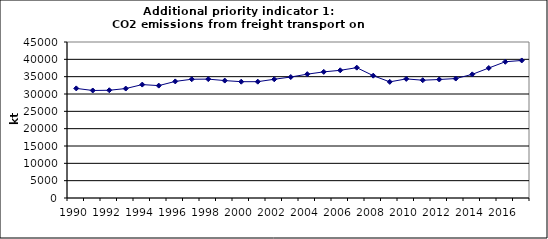
| Category | CO2 emissions from freight transport on road, kt  |
|---|---|
| 1990 | 31613.909 |
| 1991 | 31013.803 |
| 1992 | 31081.447 |
| 1993 | 31569.845 |
| 1994 | 32717.597 |
| 1995 | 32418.208 |
| 1996 | 33629.364 |
| 1997 | 34257.222 |
| 1998 | 34292.116 |
| 1999 | 33868.081 |
| 2000 | 33547.63 |
| 2001 | 33554.722 |
| 2002 | 34250.987 |
| 2003 | 34895.69 |
| 2004 | 35721.267 |
| 2005 | 36384.354 |
| 2006 | 36834.338 |
| 2007 | 37597.809 |
| 2008 | 35286.711 |
| 2009 | 33501.156 |
| 2010 | 34354.598 |
| 2011 | 33972.112 |
| 2012 | 34183.888 |
| 2013 | 34454.429 |
| 2014 | 35662.531 |
| 2015 | 37494.646 |
| 2016 | 39294.879 |
| 2017 | 39672.587 |